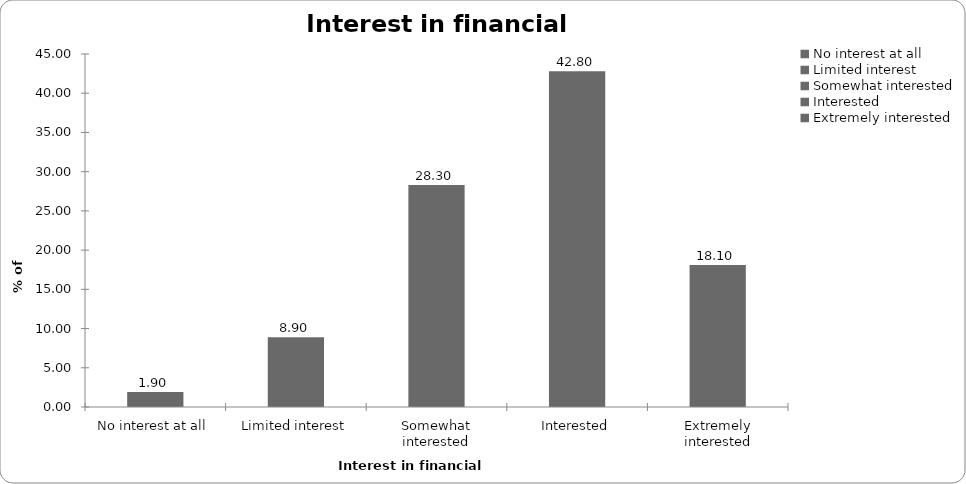
| Category | Interest in financial planning |
|---|---|
| No interest at all | 1.9 |
| Limited interest | 8.9 |
| Somewhat interested | 28.3 |
| Interested | 42.8 |
| Extremely interested | 18.1 |